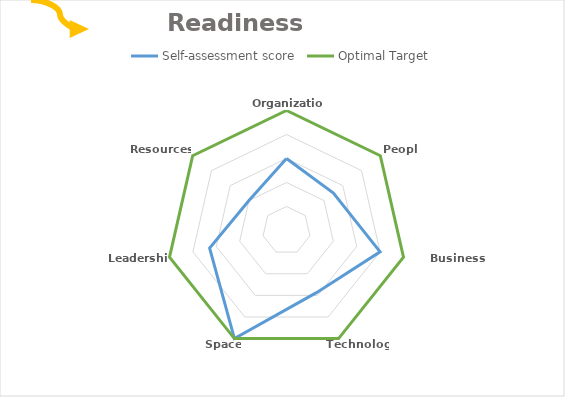
| Category | Self-assessment score | Optimal Target |
|---|---|---|
| Organization | 3 | 5 |
| People | 2.5 | 5 |
| Business Processes | 4 | 5 |
| Technology | 2.875 | 5 |
| Space | 5 | 5 |
| Leadership | 3.286 | 5 |
| Resources  | 2 | 5 |